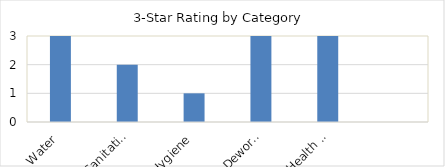
| Category | Series 0 |
|---|---|
| Water | 3 |
| Sanitation | 2 |
| Hygiene | 1 |
| Deworming | 3 |
| Health Education | 3 |